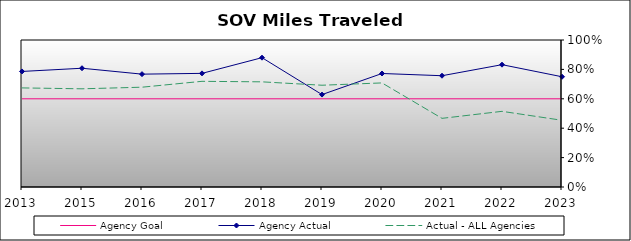
| Category | Agency Goal | Agency Actual | Actual - ALL Agencies |
|---|---|---|---|
| 2013.0 | 0.6 | 0.786 | 0.674 |
| 2015.0 | 0.6 | 0.808 | 0.668 |
| 2016.0 | 0.6 | 0.768 | 0.679 |
| 2017.0 | 0.6 | 0.773 | 0.719 |
| 2018.0 | 0.6 | 0.88 | 0.715 |
| 2019.0 | 0.6 | 0.629 | 0.692 |
| 2020.0 | 0.6 | 0.772 | 0.708 |
| 2021.0 | 0.6 | 0.757 | 0.467 |
| 2022.0 | 0.6 | 0.832 | 0.515 |
| 2023.0 | 0.6 | 0.75 | 0.454 |